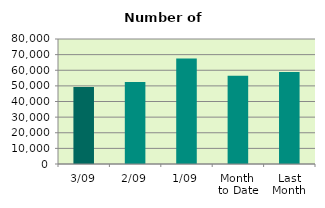
| Category | Series 0 |
|---|---|
| 3/09 | 49284 |
| 2/09 | 52464 |
| 1/09 | 67490 |
| Month 
to Date | 56412.667 |
| Last
Month | 58874.818 |